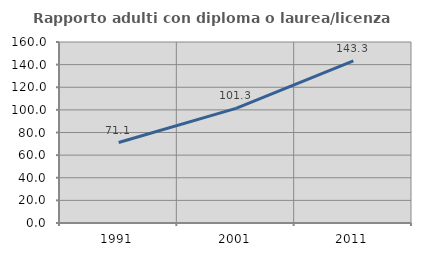
| Category | Rapporto adulti con diploma o laurea/licenza media  |
|---|---|
| 1991.0 | 71.115 |
| 2001.0 | 101.317 |
| 2011.0 | 143.344 |